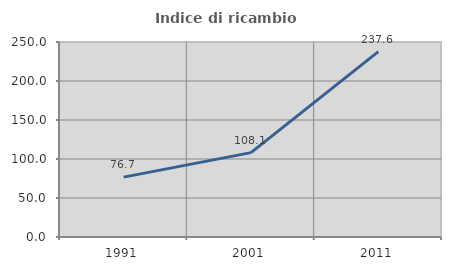
| Category | Indice di ricambio occupazionale  |
|---|---|
| 1991.0 | 76.737 |
| 2001.0 | 108.141 |
| 2011.0 | 237.644 |